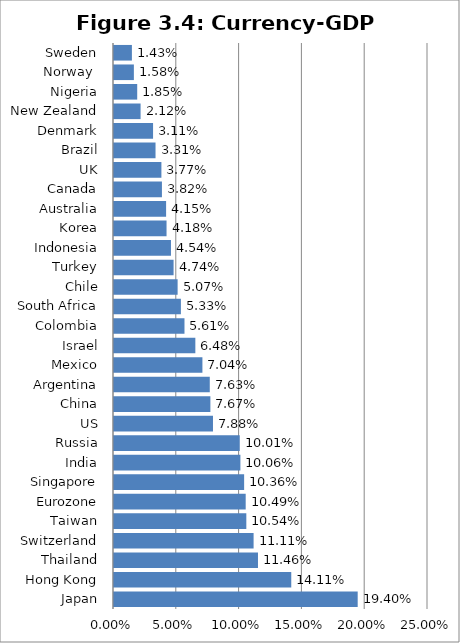
| Category | Currency-GDP Ratio |
|---|---|
| Japan | 0.194 |
| Hong Kong | 0.141 |
| Thailand | 0.115 |
| Switzerland | 0.111 |
| Taiwan | 0.105 |
| Eurozone | 0.105 |
| Singapore | 0.104 |
| India | 0.101 |
| Russia | 0.1 |
| US | 0.079 |
| China | 0.077 |
| Argentina | 0.076 |
| Mexico | 0.07 |
| Israel | 0.065 |
| Colombia | 0.056 |
| South Africa | 0.053 |
| Chile | 0.051 |
| Turkey | 0.047 |
| Indonesia | 0.045 |
| Korea | 0.042 |
| Australia | 0.041 |
| Canada | 0.038 |
| UK | 0.038 |
| Brazil | 0.033 |
| Denmark | 0.031 |
| New Zealand | 0.021 |
| Nigeria | 0.018 |
| Norway  | 0.016 |
| Sweden | 0.014 |